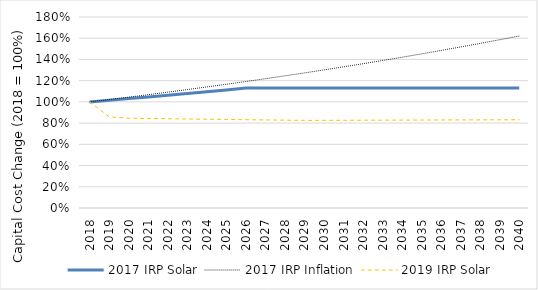
| Category | 2017 IRP Solar | 2017 IRP Inflation | 2019 IRP Solar |
|---|---|---|---|
| 2018.0 | 1 | 1 | 1 |
| 2019.0 | 1.015 | 1.022 | 0.859 |
| 2020.0 | 1.031 | 1.045 | 0.846 |
| 2021.0 | 1.047 | 1.068 | 0.844 |
| 2022.0 | 1.063 | 1.092 | 0.841 |
| 2023.0 | 1.079 | 1.116 | 0.839 |
| 2024.0 | 1.096 | 1.141 | 0.837 |
| 2025.0 | 1.113 | 1.166 | 0.835 |
| 2026.0 | 1.13 | 1.192 | 0.832 |
| 2027.0 | 1.13 | 1.218 | 0.83 |
| 2028.0 | 1.13 | 1.246 | 0.828 |
| 2029.0 | 1.13 | 1.273 | 0.826 |
| 2030.0 | 1.13 | 1.301 | 0.826 |
| 2031.0 | 1.13 | 1.33 | 0.827 |
| 2032.0 | 1.13 | 1.36 | 0.827 |
| 2033.0 | 1.13 | 1.39 | 0.828 |
| 2034.0 | 1.13 | 1.421 | 0.828 |
| 2035.0 | 1.13 | 1.452 | 0.829 |
| 2036.0 | 1.13 | 1.485 | 0.83 |
| 2037.0 | 1.13 | 1.518 | 0.83 |
| 2038.0 | 1.13 | 1.551 | 0.831 |
| 2039.0 | 1.13 | 1.586 | 0.831 |
| 2040.0 | 1.13 | 1.621 | 0.832 |